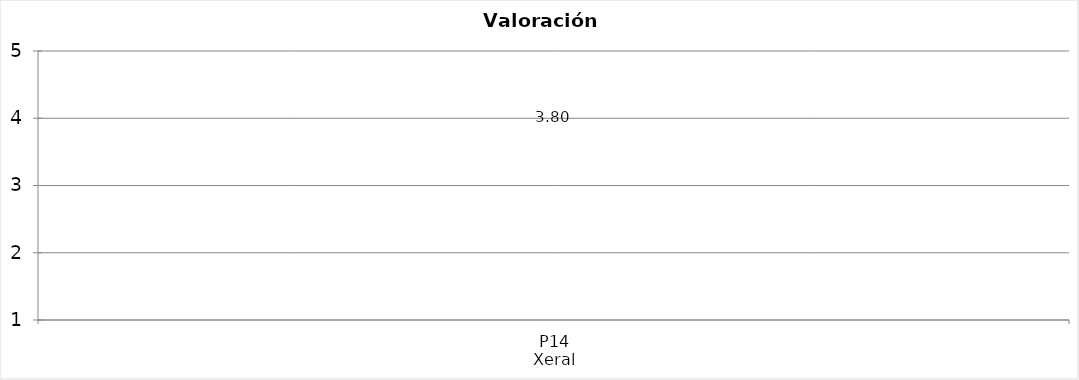
| Category | Valoración (1-5) | MEDIA |
|---|---|---|
| P14
Xeral | 3.8 | 3.8 |